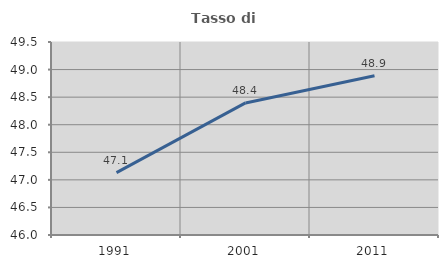
| Category | Tasso di occupazione   |
|---|---|
| 1991.0 | 47.13 |
| 2001.0 | 48.395 |
| 2011.0 | 48.887 |